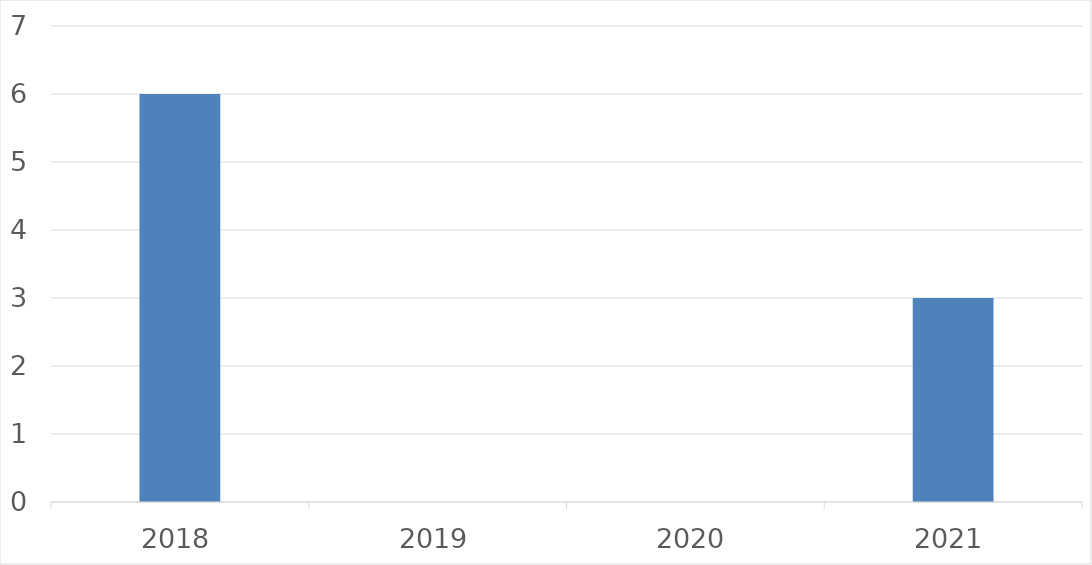
| Category | Series 0 |
|---|---|
| 2018 | 6 |
| 2019 | 0 |
| 2020 | 0 |
| 2021 | 3 |